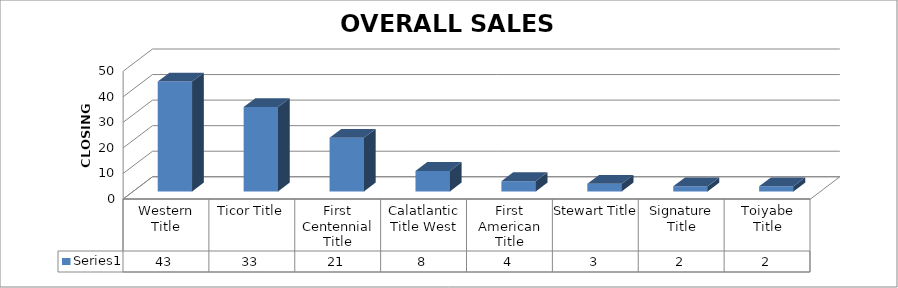
| Category | Series 0 |
|---|---|
| Western Title | 43 |
| Ticor Title | 33 |
| First Centennial Title | 21 |
| Calatlantic Title West | 8 |
| First American Title | 4 |
| Stewart Title | 3 |
| Signature Title | 2 |
| Toiyabe Title | 2 |